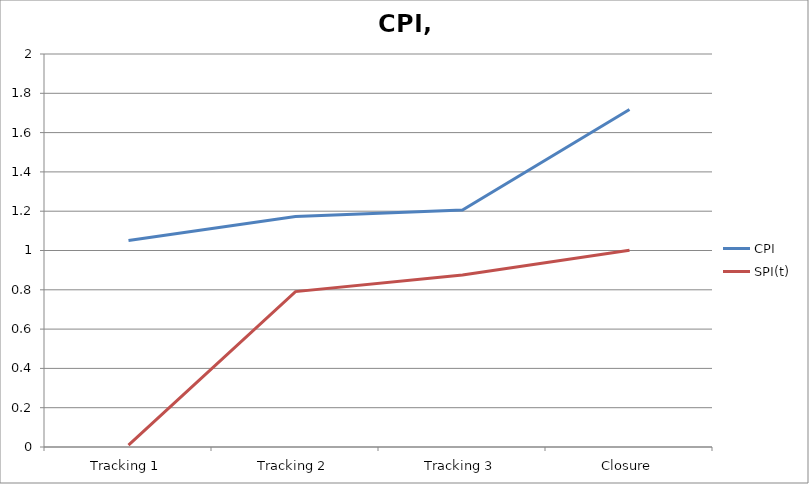
| Category | CPI | SPI(t) |
|---|---|---|
| Tracking 1 | 1.051 | 0.01 |
| Tracking 2 | 1.173 | 0.791 |
| Tracking 3 | 1.207 | 0.875 |
| Closure | 1.717 | 1.002 |